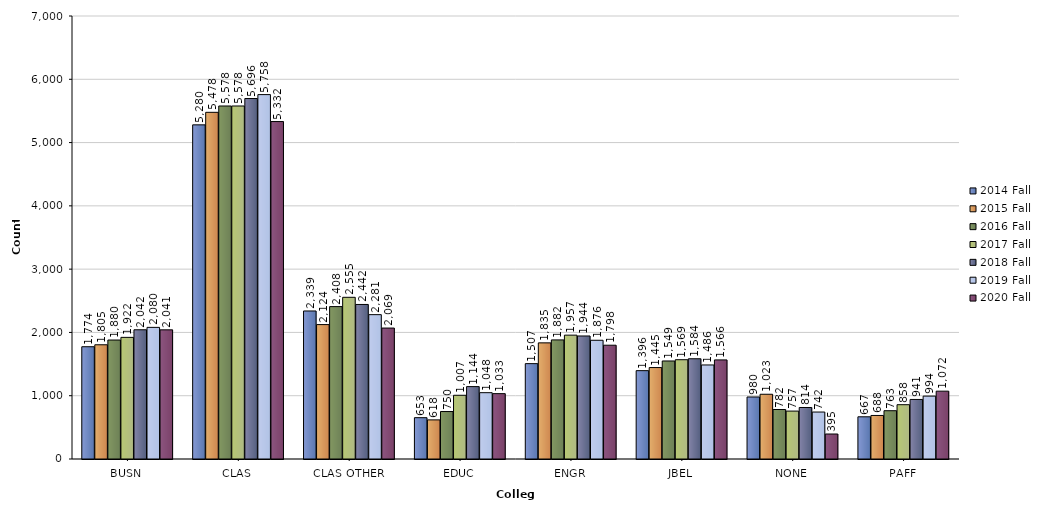
| Category | 2014 Fall | 2015 Fall | 2016 Fall | 2017 Fall | 2018 Fall | 2019 Fall | 2020 Fall |
|---|---|---|---|---|---|---|---|
| BUSN | 1774 | 1805 | 1880 | 1922 | 2042 | 2080 | 2041 |
| CLAS | 5280 | 5478 | 5578 | 5578 | 5696 | 5758 | 5332 |
| CLAS OTHER | 2339 | 2124 | 2408 | 2555 | 2442 | 2281 | 2069 |
| EDUC | 653 | 618 | 750 | 1007 | 1144 | 1048 | 1033 |
| ENGR | 1507 | 1835 | 1882 | 1957 | 1944 | 1876 | 1798 |
| JBEL | 1396 | 1445 | 1549 | 1569 | 1584 | 1486 | 1566 |
| NONE | 980 | 1023 | 782 | 757 | 814 | 742 | 395 |
| PAFF | 667 | 688 | 763 | 858 | 941 | 994 | 1072 |